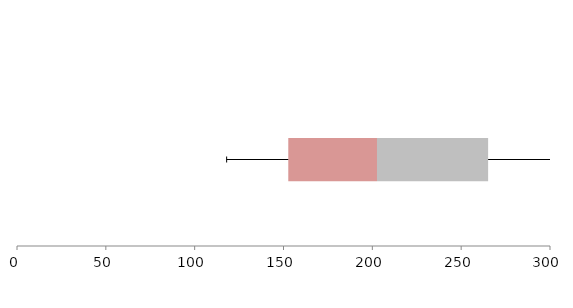
| Category | Series 1 | Series 2 | Series 3 |
|---|---|---|---|
| 0 | 152.693 | 49.928 | 62.551 |